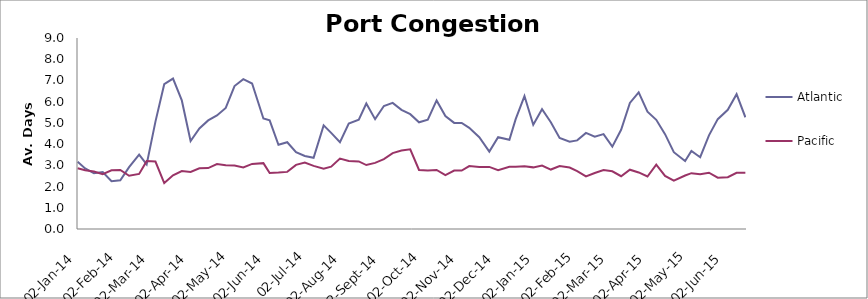
| Category | Atlantic  | Pacific |
|---|---|---|
| 2014-01-02 | 3.167 | 2.863 |
| 2014-01-08 | 2.854 | 2.767 |
| 2014-01-15 | 2.625 | 2.712 |
| 2014-01-22 | 2.688 | 2.582 |
| 2014-01-29 | 2.25 | 2.767 |
| 2014-02-05 | 2.292 | 2.781 |
| 2014-02-12 | 2.917 | 2.507 |
| 2014-02-20 | 3.5 | 2.596 |
| 2014-02-26 | 3.042 | 3.199 |
| 2014-03-05 | 5.059 | 3.178 |
| 2014-03-12 | 6.824 | 2.164 |
| 2014-03-19 | 7.088 | 2.527 |
| 2014-03-26 | 6.059 | 2.733 |
| 2014-04-02 | 4.147 | 2.692 |
| 2014-04-09 | 4.735 | 2.863 |
| 2014-04-16 | 5.118 | 2.87 |
| 2014-04-23 | 5.353 | 3.062 |
| 2014-04-30 | 5.706 | 3 |
| 2014-05-07 | 6.735 | 2.993 |
| 2014-05-14 | 7.059 | 2.904 |
| 2014-05-21 | 6.853 | 3.068 |
| 2014-05-30 | 5.206 | 3.103 |
| 2014-06-04 | 5.118 | 2.637 |
| 2014-06-11 | 3.971 | 2.658 |
| 2014-06-18 | 4.088 | 2.692 |
| 2014-06-25 | 3.618 | 3.021 |
| 2014-07-02 | 3.441 | 3.13 |
| 2014-07-09 | 3.353 | 2.973 |
| 2014-07-17 | 4.882 | 2.836 |
| 2014-07-23 | 4.529 | 2.938 |
| 2014-07-30 | 4.088 | 3.322 |
| 2014-08-06 | 4.971 | 3.205 |
| 2014-08-14 | 5.147 | 3.185 |
| 2014-08-20 | 5.912 | 3.014 |
| 2014-08-27 | 5.176 | 3.116 |
| 2014-09-03 | 5.794 | 3.295 |
| 2014-09-10 | 5.941 | 3.575 |
| 2014-09-17 | 5.618 | 3.699 |
| 2014-09-24 | 5.412 | 3.753 |
| 2014-10-01 | 5.029 | 2.781 |
| 2014-10-08 | 5.147 | 2.753 |
| 2014-10-15 | 6.059 | 2.785 |
| 2014-10-22 | 5.324 | 2.541 |
| 2014-10-29 | 5 | 2.753 |
| 2014-11-04 | 5 | 2.753 |
| 2014-11-10 | 4.765 | 2.966 |
| 2014-11-18 | 4.324 | 2.918 |
| 2014-11-26 | 3.647 | 2.925 |
| 2014-12-03 | 4.324 | 2.767 |
| 2014-12-12 | 4.206 | 2.932 |
| 2014-12-17 | 5.176 | 2.938 |
| 2014-12-24 | 6.265 | 2.952 |
| 2014-12-31 | 4.912 | 2.904 |
| 2015-01-07 | 5.647 | 2.993 |
| 2015-01-14 | 5.029 | 2.801 |
| 2015-01-21 | 4.294 | 2.966 |
| 2015-01-29 | 4.118 | 2.897 |
| 2015-02-04 | 4.176 | 2.726 |
| 2015-02-11 | 4.529 | 2.479 |
| 2015-02-18 | 4.353 | 2.637 |
| 2015-02-25 | 4.471 | 2.774 |
| 2015-03-04 | 3.882 | 2.719 |
| 2015-03-11 | 4.676 | 2.486 |
| 2015-03-18 | 5.941 | 2.795 |
| 2015-03-25 | 6.441 | 2.664 |
| 2015-04-01 | 5.529 | 2.473 |
| 2015-04-08 | 5.147 | 3.027 |
| 2015-04-15 | 4.471 | 2.5 |
| 2015-04-22 | 3.618 | 2.274 |
| 2015-05-01 | 3.206 | 2.521 |
| 2015-05-06 | 3.676 | 2.63 |
| 2015-05-13 | 3.382 | 2.575 |
| 2015-05-20 | 4.412 | 2.651 |
| 2015-05-27 | 5.176 | 2.418 |
| 2015-06-04 | 5.618 | 2.442 |
| 2015-06-11 | 6.353 | 2.645 |
| 2015-06-18 | 5.265 | 2.651 |